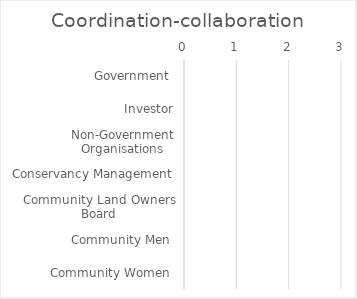
| Category | Coordination-collaboration |
|---|---|
| Government  | 0 |
| Investor | 0 |
| Non-Government Organisations | 0 |
| Conservancy Management | 0 |
| Community Land Owners Board | 0 |
| Community Men  | 0 |
| Community Women  | 0 |